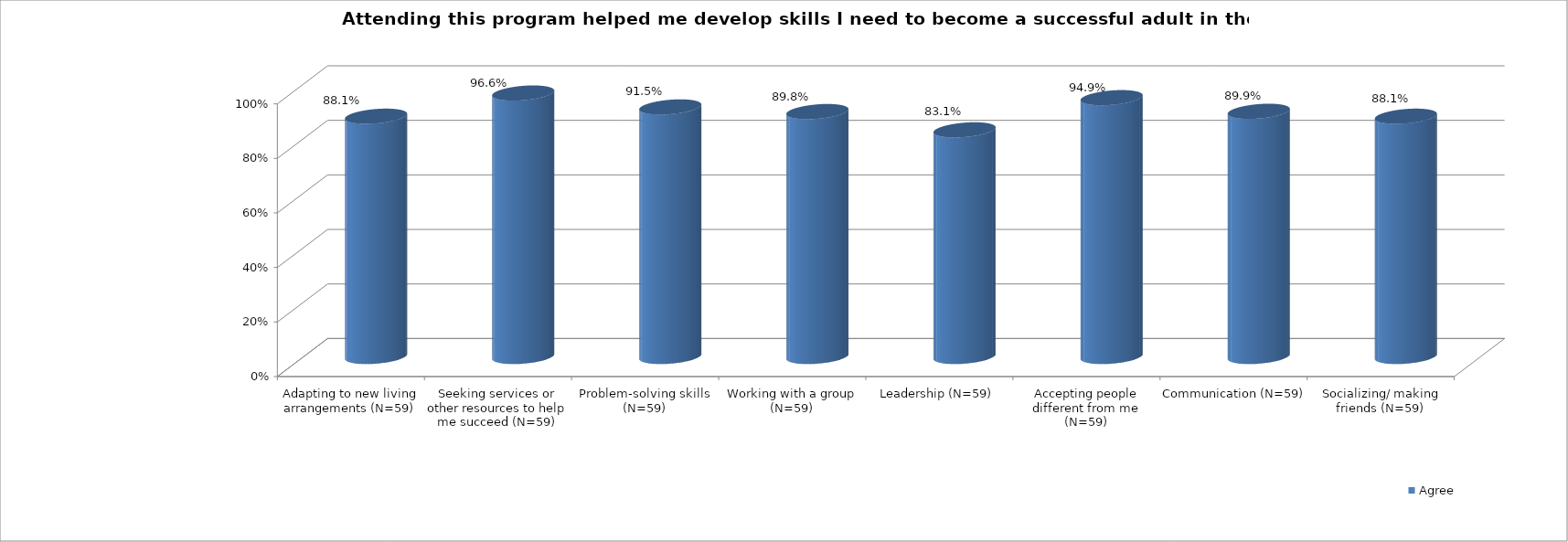
| Category | Agree |
|---|---|
| Adapting to new living arrangements (N=59) | 0.881 |
| Seeking services or other resources to help me succeed (N=59) | 0.966 |
| Problem-solving skills (N=59) | 0.915 |
| Working with a group (N=59) | 0.898 |
| Leadership (N=59) | 0.831 |
| Accepting people different from me (N=59) | 0.949 |
| Communication (N=59) | 0.899 |
| Socializing/ making friends (N=59) | 0.881 |